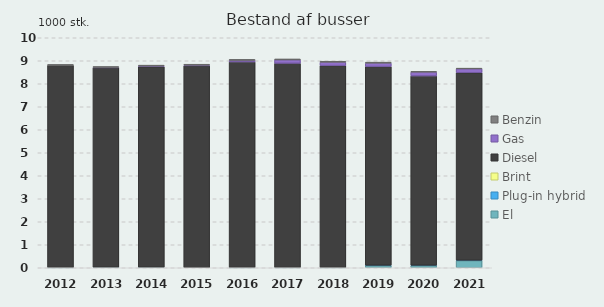
| Category | El | Plug-in hybrid | Brint | Diesel | Gas | Benzin |
|---|---|---|---|---|---|---|
| 2012 | 0.01 | 0 | 0 | 8.79 | 0 | 0.04 |
| 2013 | 0.02 | 0 | 0 | 8.68 | 0.01 | 0.04 |
| 2014 | 0.02 | 0 | 0 | 8.72 | 0.03 | 0.04 |
| 2015 | 0 | 0 | 0 | 8.78 | 0.03 | 0.04 |
| 2016 | 0.01 | 0 | 0 | 8.94 | 0.07 | 0.04 |
| 2017 | 0.01 | 0 | 0 | 8.88 | 0.15 | 0.04 |
| 2018 | 0.01 | 0 | 0 | 8.78 | 0.15 | 0.04 |
| 2019 | 0.09 | 0.02 | 0 | 8.64 | 0.15 | 0.04 |
| 2020 | 0.09 | 0.02 | 0 | 8.23 | 0.17 | 0.03 |
| 2021 | 0.31 | 0.02 | 0 | 8.15 | 0.17 | 0.03 |